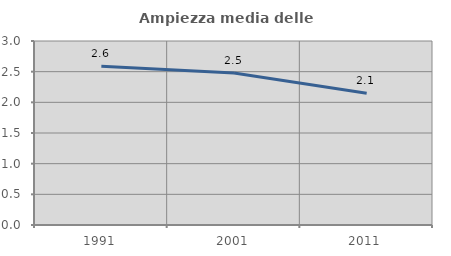
| Category | Ampiezza media delle famiglie |
|---|---|
| 1991.0 | 2.589 |
| 2001.0 | 2.478 |
| 2011.0 | 2.149 |